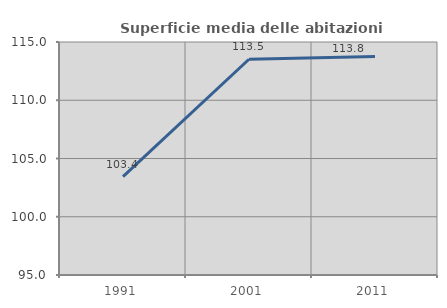
| Category | Superficie media delle abitazioni occupate |
|---|---|
| 1991.0 | 103.447 |
| 2001.0 | 113.518 |
| 2011.0 | 113.751 |